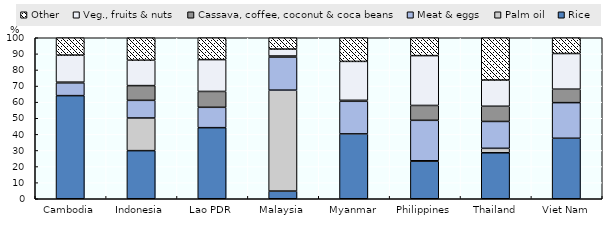
| Category | Rice | Palm oil | Meat & eggs | Cassava, coffee, coconut & coca beans | Veg., fruits & nuts | Other |
|---|---|---|---|---|---|---|
| Cambodia | 64.045 | 0 | 7.959 | 0.422 | 16.807 | 10.766 |
| Indonesia | 29.887 | 20.279 | 10.957 | 9.152 | 15.781 | 13.944 |
| Lao PDR | 44.152 | 0 | 12.644 | 9.865 | 19.759 | 13.581 |
| Malaysia | 4.772 | 62.68 | 20.554 | 0.657 | 4.316 | 7.019 |
| Myanmar | 40.287 | 0 | 20.25 | 0.611 | 24.174 | 14.678 |
| Philippines | 23.349 | 0.241 | 25.122 | 9.24 | 30.947 | 11.1 |
| Thailand | 28.554 | 2.765 | 16.697 | 9.445 | 16.276 | 26.263 |
| Viet Nam | 37.577 | 0 | 22.119 | 8.369 | 22.144 | 9.79 |